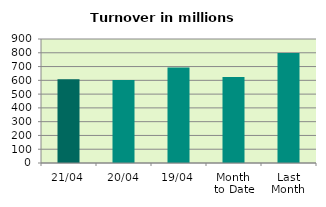
| Category | Series 0 |
|---|---|
| 21/04 | 607.644 |
| 20/04 | 602.583 |
| 19/04 | 693.206 |
| Month 
to Date | 623.464 |
| Last
Month | 798.115 |